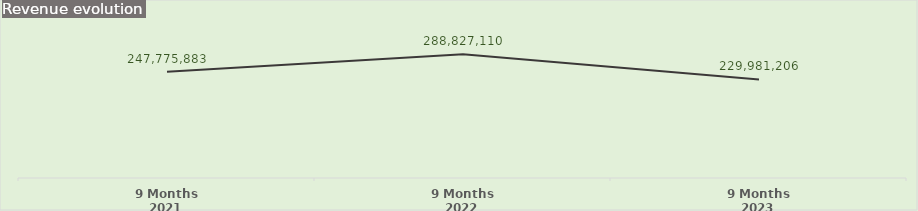
| Category | Series 1 |
|---|---|
| 9 Months 2021 | 247775883 |
| 9 Months 2022 | 288827110 |
| 9 Months 2023 | 229981206 |